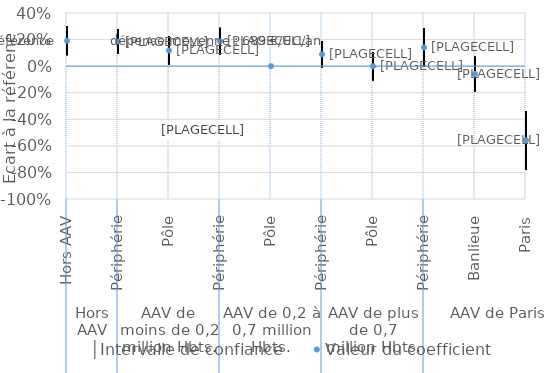
| Category | │Intervalle de confiance | Series 1 | Valeur du coefficient |
|---|---|---|---|
| 0 | 0.3 | 0.082 | 0.191 |
| 1 | 0.279 | 0.091 | 0.185 |
| 2 | 0.225 | 0.011 | 0.118 |
| 3 | 0.289 | 0.088 | 0.188 |
| 4 | 0 | 0 | 0 |
| 5 | 0.189 | -0.011 | 0.089 |
| 6 | 0.105 | -0.108 | -0.001 |
| 7 | 0.287 | -0.006 | 0.141 |
| 8 | 0.072 | -0.19 | -0.059 |
| 9 | -0.337 | -0.78 | -0.558 |